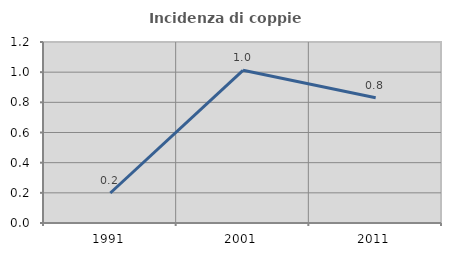
| Category | Incidenza di coppie miste |
|---|---|
| 1991.0 | 0.199 |
| 2001.0 | 1.012 |
| 2011.0 | 0.83 |